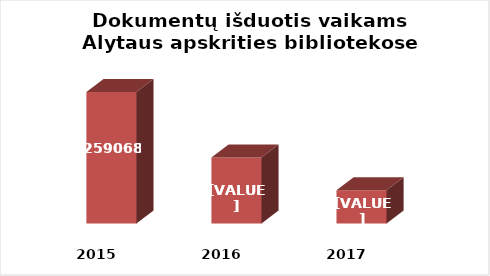
| Category | Series 0 |
|---|---|
| 2015.0 | 259068 |
| 2016.0 | 247062 |
| 2017.0 | 241078 |